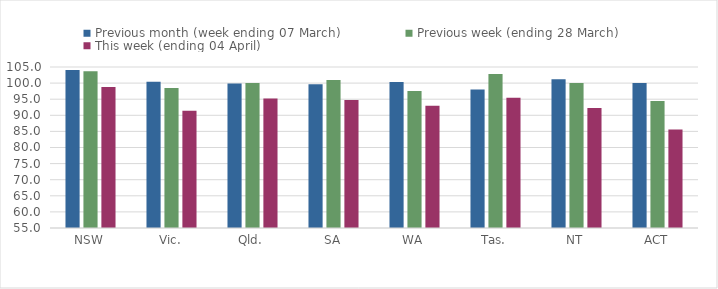
| Category | Previous month (week ending 07 March) | Previous week (ending 28 March) | This week (ending 04 April) |
|---|---|---|---|
| NSW | 104.061 | 103.648 | 98.751 |
| Vic. | 100.396 | 98.455 | 91.433 |
| Qld. | 99.867 | 100.044 | 95.234 |
| SA | 99.636 | 100.934 | 94.739 |
| WA | 100.375 | 97.54 | 92.996 |
| Tas. | 97.976 | 102.797 | 95.473 |
| NT | 101.211 | 100 | 92.252 |
| ACT | 100 | 94.444 | 85.556 |